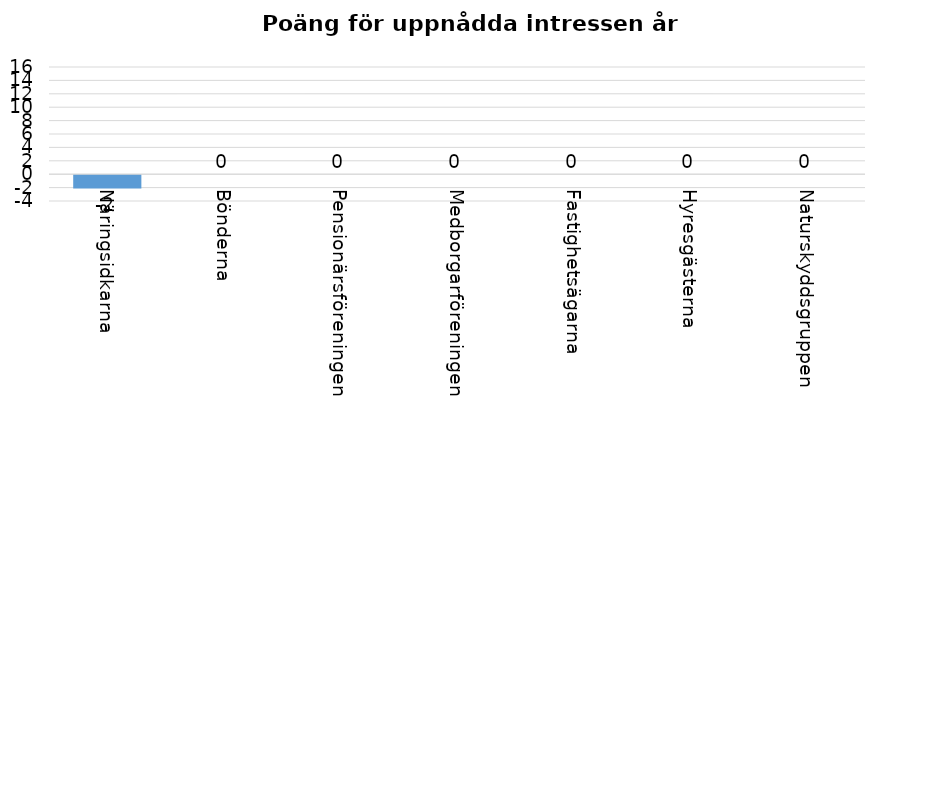
| Category | Series 0 |
|---|---|
| Näringsidkarna | -2 |
| Bönderna | 0 |
| Pensionärsföreningen | 0 |
| Medborgarföreningen | 0 |
| Fastighetsägarna | 0 |
| Hyresgästerna | 0 |
| Naturskyddsgruppen | 0 |